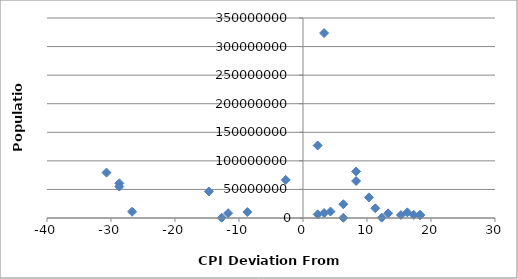
| Category | Population |
|---|---|
| 6.299999999999997 | 24104700 |
| 3.299999999999997 | 8662588 |
| 4.299999999999997 | 11250585 |
| 10.299999999999997 | 36048521 |
| 18.299999999999997 | 5707251 |
| 17.299999999999997 | 5488543 |
| -2.700000000000003 | 66689000 |
| 8.299999999999997 | 81459000 |
| -26.700000000000003 | 10955000 |
| 6.299999999999997 | 332529 |
| 2.299999999999997 | 6378000 |
| -11.700000000000003 | 8502900 |
| -28.700000000000003 | 60674003 |
| 2.299999999999997 | 126919659 |
| 12.299999999999997 | 562958 |
| -12.700000000000003 | 445426 |
| 11.299999999999997 | 17000059 |
| 18.299999999999997 | 4691480 |
| 15.299999999999997 | 5214900 |
| -8.700000000000003 | 10427301 |
| -28.700000000000003 | 54956900 |
| -14.700000000000003 | 46423064 |
| 16.299999999999997 | 9875378 |
| 13.299999999999997 | 8211700 |
| -30.700000000000003 | 79463663 |
| 8.299999999999997 | 64716000 |
| 3.299999999999997 | 323625762 |